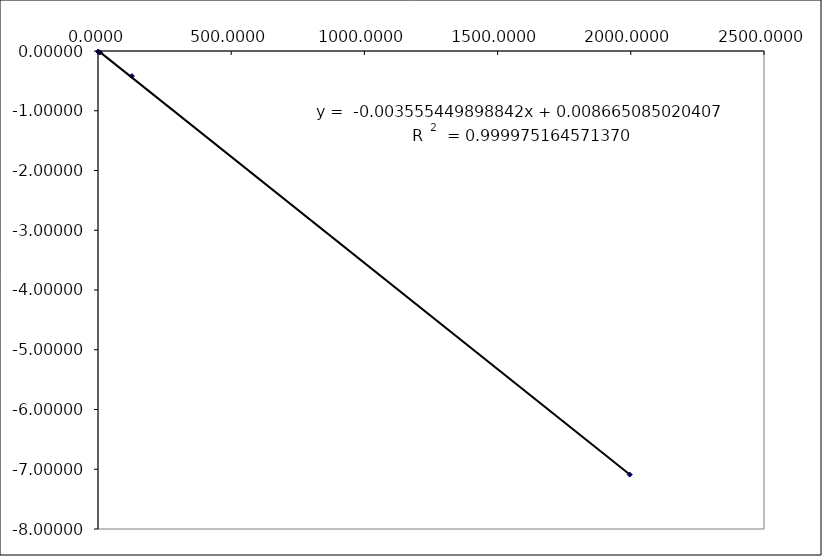
| Category | Series 0 |
|---|---|
| 127.27000005333457 | -0.419 |
| 7.303569607554442 | -0.024 |
| 0.5241373032618551 | -0.009 |
| 1996.0591887946227 | -7.09 |